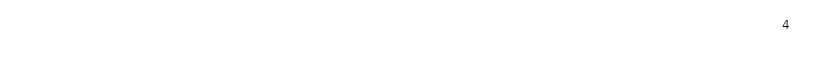
| Category | Итоговая оценка |
|---|---|
| Вопрос 3 | 4 |